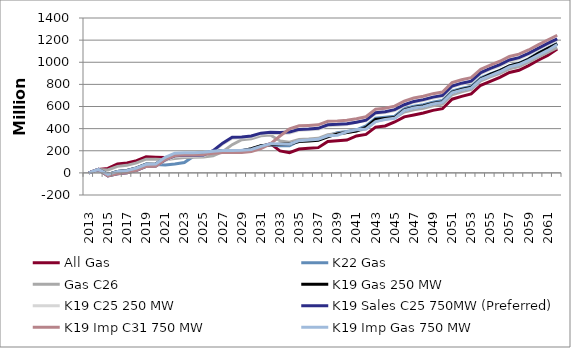
| Category | All Gas | K22 Gas | Gas C26 | K19 Gas 250 MW | K19 C25 250 MW | K19 Sales C25 750MW (Preferred) | K19 Imp C31 750 MW | K19 Imp Gas 750 MW |
|---|---|---|---|---|---|---|---|---|
| 2013.0 | 0 | 0 | 0 | 0 | 0 | 0 | 0 | 0 |
| 2014.0 | 31 | 31 | 31 | 31 | 31 | 31 | 31 | 31 |
| 2015.0 | 40 | -13 | 26 | -13 | -27 | -27 | -27 | -13 |
| 2016.0 | 80 | 13 | 59 | 13 | -8 | -8 | -8 | 13 |
| 2017.0 | 89 | 22 | 68 | 22 | 1 | 1 | 1 | 22 |
| 2018.0 | 110 | 44 | 90 | 44 | 23 | 23 | 23 | 44 |
| 2019.0 | 145 | 79 | 124 | 78 | 59 | 59 | 58 | 78 |
| 2020.0 | 142 | 75 | 123 | 81 | 62 | 62 | 60 | 81 |
| 2021.0 | 138 | 72 | 119 | 131 | 112 | 119 | 120 | 141 |
| 2022.0 | 148 | 81 | 129 | 165 | 146 | 154 | 157 | 178 |
| 2023.0 | 159 | 93 | 140 | 171 | 152 | 160 | 162 | 183 |
| 2024.0 | 160 | 153 | 141 | 170 | 151 | 159 | 162 | 182 |
| 2025.0 | 165 | 182 | 144 | 180 | 154 | 162 | 167 | 186 |
| 2026.0 | 182 | 192 | 154 | 192 | 193 | 201 | 177 | 196 |
| 2027.0 | 191 | 199 | 191 | 199 | 261 | 269 | 184 | 203 |
| 2028.0 | 191 | 200 | 255 | 199 | 314 | 322 | 184 | 203 |
| 2029.0 | 199 | 201 | 300 | 201 | 317 | 325 | 185 | 204 |
| 2030.0 | 209 | 216 | 308 | 218 | 325 | 333 | 193 | 212 |
| 2031.0 | 236 | 244 | 335 | 246 | 351 | 359 | 220 | 239 |
| 2032.0 | 264 | 254 | 343 | 254 | 359 | 367 | 262 | 264 |
| 2033.0 | 199 | 246 | 289 | 258 | 357 | 365 | 333 | 260 |
| 2034.0 | 183 | 246 | 278 | 260 | 361 | 369 | 399 | 259 |
| 2035.0 | 216 | 291 | 302 | 284 | 385 | 393 | 425 | 291 |
| 2036.0 | 222 | 299 | 306 | 288 | 389 | 397 | 429 | 297 |
| 2037.0 | 228 | 305 | 312 | 294 | 395 | 403 | 434 | 303 |
| 2038.0 | 283 | 337 | 344 | 325 | 427 | 435 | 466 | 335 |
| 2039.0 | 291 | 364 | 357 | 352 | 431 | 439 | 470 | 340 |
| 2040.0 | 297 | 375 | 365 | 364 | 437 | 445 | 476 | 371 |
| 2041.0 | 334 | 389 | 380 | 378 | 460 | 458 | 490 | 389 |
| 2042.0 | 348 | 424 | 399 | 412 | 470 | 476 | 507 | 397 |
| 2043.0 | 414 | 495 | 467 | 483 | 536 | 544 | 576 | 463 |
| 2044.0 | 424 | 504 | 486 | 492 | 545 | 553 | 584 | 482 |
| 2045.0 | 460 | 512 | 498 | 500 | 563 | 572 | 603 | 493 |
| 2046.0 | 506 | 580 | 550 | 568 | 608 | 616 | 648 | 563 |
| 2047.0 | 523 | 603 | 570 | 591 | 638 | 646 | 677 | 586 |
| 2048.0 | 541 | 616 | 583 | 604 | 653 | 662 | 693 | 599 |
| 2049.0 | 565 | 639 | 606 | 627 | 676 | 685 | 716 | 622 |
| 2050.0 | 580 | 654 | 621 | 642 | 692 | 700 | 731 | 637 |
| 2051.0 | 666 | 739 | 706 | 728 | 777 | 785 | 816 | 723 |
| 2052.0 | 691 | 764 | 732 | 753 | 802 | 811 | 842 | 748 |
| 2053.0 | 714 | 782 | 754 | 771 | 820 | 829 | 860 | 766 |
| 2054.0 | 792 | 860 | 832 | 848 | 897 | 906 | 937 | 843 |
| 2055.0 | 827 | 895 | 867 | 891 | 935 | 944 | 975 | 879 |
| 2056.0 | 863 | 926 | 899 | 924 | 968 | 978 | 1009 | 914 |
| 2057.0 | 907 | 968 | 941 | 967 | 1011 | 1021 | 1052 | 958 |
| 2058.0 | 927 | 992 | 962 | 988 | 1032 | 1042 | 1073 | 979 |
| 2059.0 | 970 | 1031 | 1000 | 1027 | 1070 | 1080 | 1111 | 1017 |
| 2060.0 | 1018 | 1082 | 1045 | 1078 | 1116 | 1126 | 1157 | 1063 |
| 2061.0 | 1062 | 1127 | 1089 | 1123 | 1160 | 1170 | 1201 | 1107 |
| 2062.0 | 1120 | 1170 | 1132 | 1166 | 1202 | 1212 | 1244 | 1161 |